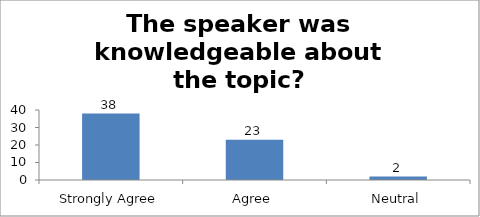
| Category | The speaker was knowledgeable about the topic? |
|---|---|
| Strongly Agree | 38 |
| Agree | 23 |
| Neutral | 2 |